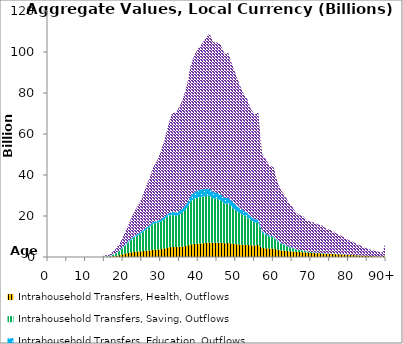
| Category | Intrahousehold Transfers, Health, Outflows | Intrahousehold Transfers, Saving, Outflows | Intrahousehold Transfers, Education, Outflows | Intrahousehold Transfers, Consumption other than health and education, Outflows |
|---|---|---|---|---|
| 0 | 0 | 0 | 0 | 0 |
|  | 0 | 0 | 0 | 0 |
| 2 | 0 | 0 | 0 | 0 |
| 3 | 0 | 0 | 0 | 0 |
| 4 | 0 | 0 | 0 | 0 |
| 5 | 0 | 0 | 0 | 0 |
| 6 | 0 | 0 | 0 | 0 |
| 7 | 0 | 0 | 0 | 0 |
| 8 | 0 | 0 | 0 | 0 |
| 9 | 0 | 0 | 0 | 0 |
| 10 | 0 | 0 | 0 | 0 |
| 11 | 0 | 0 | 0 | 0 |
| 12 | 0 | 0 | 0 | 0 |
| 13 | 0 | 0 | 0 | 0 |
| 14 | 0 | 0 | 0 | 0 |
| 15 | 70.802 | 164.481 | 5.983 | 506.907 |
| 16 | 140.992 | 317.122 | 14.817 | 490.84 |
| 17 | 285.403 | 621.515 | 37.302 | 1254.418 |
| 18 | 547.837 | 1172.416 | 84.038 | 2110.194 |
| 19 | 901.496 | 2003.284 | 189.925 | 3345.722 |
| 20 | 1362.379 | 3247.258 | 335.856 | 5141.495 |
| 21 | 1784.997 | 4567.281 | 522.155 | 7147.069 |
| 22 | 2209.358 | 5938.851 | 654.153 | 9428.448 |
| 23 | 2496.553 | 7112.861 | 669.543 | 11916.379 |
| 24 | 2639.123 | 7892.61 | 762.487 | 13896.083 |
| 25 | 2798.483 | 9002.836 | 791.178 | 16364.623 |
| 26 | 3062.108 | 10216.299 | 810.567 | 19903.458 |
| 27 | 3223.568 | 11275.97 | 860.296 | 22913.469 |
| 28 | 3530.299 | 12701.126 | 926.531 | 26706.851 |
| 29 | 3607.571 | 13096.235 | 944.68 | 29148.039 |
| 30 | 3877.126 | 13331.27 | 990.427 | 33175.274 |
| 31 | 4191.906 | 14229.762 | 1140.838 | 37499.163 |
| 32 | 4616.133 | 15235.351 | 1249.799 | 43082.428 |
| 33 | 4934.799 | 15687.865 | 1562.857 | 47928.798 |
| 34 | 4870.477 | 15135.408 | 1611.316 | 48760.407 |
| 35 | 4982.388 | 15723.28 | 1746.825 | 50820.328 |
| 36 | 5202.475 | 16873.515 | 1880.059 | 53751.422 |
| 37 | 5518.907 | 18411.739 | 2395.878 | 57535.598 |
| 38 | 6084.958 | 20994.185 | 2710.35 | 63876.333 |
| 39 | 6352.368 | 22250.96 | 2987.989 | 67088.477 |
| 40 | 6482.571 | 22562.143 | 3578.83 | 69114.872 |
| 41 | 6647.475 | 22730.471 | 3631.968 | 71072.131 |
| 42 | 6866.591 | 22896.226 | 3402.962 | 73600.92 |
| 43 | 7089.724 | 22867.925 | 3398.743 | 75669.482 |
| 44 | 6905.467 | 21644.612 | 3127.717 | 73173.031 |
| 45 | 6980.907 | 21482.123 | 2817.325 | 73395.572 |
| 46 | 6956.977 | 20694.285 | 2986.229 | 72999.357 |
| 47 | 6717.46 | 19359.208 | 2741.202 | 70174.072 |
| 48 | 6805.414 | 19142.967 | 2876.004 | 70674.42 |
| 49 | 6505.745 | 17729.244 | 2975.957 | 66892.438 |
| 50 | 6308.112 | 16415.216 | 2792.159 | 63734.586 |
| 51 | 6091.26 | 15441.626 | 2396.208 | 60179.924 |
| 52 | 5936.206 | 14509.631 | 2297.314 | 57137.443 |
| 53 | 5894.625 | 13684.621 | 2117.176 | 55504.471 |
| 54 | 5685.301 | 12252.674 | 1801.824 | 52549.702 |
| 55 | 5642.682 | 11179.003 | 1594.905 | 51135.124 |
| 56 | 5893.438 | 10753.302 | 1526.768 | 52278.03 |
| 57 | 4358.931 | 7403.962 | 837.05 | 37750.511 |
| 58 | 4286.223 | 6510.659 | 685.214 | 36233.622 |
| 59 | 4126.276 | 5913.87 | 477.615 | 34053.741 |
| 60 | 4164.711 | 5450.123 | 425.178 | 33940.766 |
| 61 | 3582.724 | 4283.486 | 374.967 | 28973.656 |
| 62 | 3238.069 | 3264.303 | 332.32 | 25894.244 |
| 63 | 3060.766 | 2753.68 | 341.304 | 24012.729 |
| 64 | 2846.142 | 2133.329 | 254.107 | 21657.833 |
| 65 | 2722.787 | 1681.36 | 217.793 | 20035.891 |
| 66 | 2498.573 | 1224.913 | 142.19 | 17877.891 |
| 67 | 2390.595 | 959.822 | 151.167 | 16944.788 |
| 68 | 2340.625 | 724.314 | 119.29 | 16605.052 |
| 69 | 2068.103 | 515.906 | 108.269 | 15029.666 |
| 70 | 1992.699 | 396.413 | 67.249 | 14790.383 |
| 71 | 1897.043 | 306.146 | 65.581 | 14330.627 |
| 72 | 1806.259 | 224.432 | 103.294 | 13717.352 |
| 73 | 1754.368 | 166.466 | 94.276 | 13363.983 |
| 74 | 1598.106 | 109.382 | 86.743 | 12105.662 |
| 75 | 1537.107 | 78.925 | 139.921 | 11565.877 |
| 76 | 1441.329 | 53.908 | 116.274 | 10714.669 |
| 77 | 1331.556 | 39.811 | 59.792 | 9759.105 |
| 78 | 1264.958 | 31.951 | 45.34 | 9114.947 |
| 79 | 1153.268 | 24.073 | 42.194 | 8188.836 |
| 80 | 1036.535 | 18.438 | 38.907 | 7208.81 |
| 81 | 953.243 | 15.261 | 35.812 | 6487.595 |
| 82 | 853.597 | 12.389 | 38.642 | 5716.404 |
| 83 | 757.978 | 10.041 | 28.647 | 4999.873 |
| 84 | 618.163 | 8.335 | 18.119 | 4011.493 |
| 85 | 558.232 | 7.726 | 9.872 | 3593.306 |
| 86 | 463.51 | 6.594 | 7.823 | 2967.936 |
| 87 | 397.383 | 5.815 | 4.937 | 2535.41 |
| 88 | 342.715 | 5.162 | 2.385 | 2179.897 |
| 89 | 283.357 | 4.392 | 1.331 | 1795.713 |
| 90+ | 1039.853 | 16.588 | 3.3 | 6567.074 |